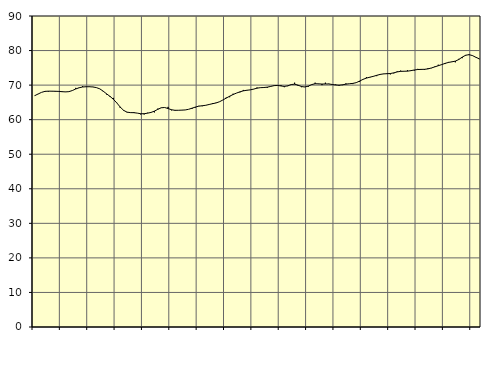
| Category | Piggar | Series 1 |
|---|---|---|
| nan | 67 | 66.94 |
| 87.0 | 67.4 | 67.44 |
| 87.0 | 67.9 | 67.9 |
| 87.0 | 68.3 | 68.19 |
| nan | 68.1 | 68.25 |
| 88.0 | 68.3 | 68.24 |
| 88.0 | 68.1 | 68.22 |
| 88.0 | 68.1 | 68.18 |
| nan | 68 | 68.1 |
| 89.0 | 68 | 68.04 |
| 89.0 | 68.1 | 68.11 |
| 89.0 | 68.4 | 68.43 |
| nan | 69.2 | 68.88 |
| 90.0 | 69.3 | 69.24 |
| 90.0 | 69.7 | 69.45 |
| 90.0 | 69.5 | 69.53 |
| nan | 69.6 | 69.53 |
| 91.0 | 69.5 | 69.46 |
| 91.0 | 69.3 | 69.29 |
| 91.0 | 68.9 | 68.93 |
| nan | 68.2 | 68.27 |
| 92.0 | 67.3 | 67.49 |
| 92.0 | 66.6 | 66.75 |
| 92.0 | 66.3 | 65.91 |
| nan | 64.9 | 64.85 |
| 93.0 | 63.4 | 63.65 |
| 93.0 | 62.8 | 62.69 |
| 93.0 | 62.1 | 62.17 |
| nan | 62.1 | 62.04 |
| 94.0 | 62.2 | 62.02 |
| 94.0 | 61.9 | 61.89 |
| 94.0 | 61.5 | 61.72 |
| nan | 61.5 | 61.72 |
| 95.0 | 62 | 61.88 |
| 95.0 | 62.1 | 62.09 |
| 95.0 | 62.1 | 62.47 |
| nan | 63.2 | 62.99 |
| 96.0 | 63.5 | 63.44 |
| 96.0 | 63.5 | 63.52 |
| 96.0 | 63.7 | 63.22 |
| nan | 62.7 | 62.87 |
| 97.0 | 62.8 | 62.71 |
| 97.0 | 62.7 | 62.72 |
| 97.0 | 62.8 | 62.76 |
| nan | 62.8 | 62.81 |
| 98.0 | 63 | 63 |
| 98.0 | 63.1 | 63.32 |
| 98.0 | 63.5 | 63.65 |
| nan | 64 | 63.91 |
| 99.0 | 63.9 | 64.03 |
| 99.0 | 64.2 | 64.16 |
| 99.0 | 64.4 | 64.39 |
| nan | 64.8 | 64.62 |
| 0.0 | 64.9 | 64.83 |
| 0.0 | 65.2 | 65.17 |
| 0.0 | 65.7 | 65.68 |
| nan | 66.4 | 66.24 |
| 1.0 | 66.5 | 66.79 |
| 1.0 | 67.5 | 67.27 |
| 1.0 | 67.7 | 67.69 |
| nan | 67.9 | 68.05 |
| 2.0 | 68.6 | 68.34 |
| 2.0 | 68.4 | 68.51 |
| 2.0 | 68.6 | 68.62 |
| nan | 68.8 | 68.84 |
| 3.0 | 69.3 | 69.11 |
| 3.0 | 69.3 | 69.26 |
| 3.0 | 69.2 | 69.3 |
| nan | 69.2 | 69.41 |
| 4.0 | 69.7 | 69.62 |
| 4.0 | 69.9 | 69.85 |
| 4.0 | 70 | 69.91 |
| nan | 70 | 69.76 |
| 5.0 | 69.4 | 69.62 |
| 5.0 | 69.7 | 69.79 |
| 5.0 | 70.2 | 70.16 |
| nan | 70.7 | 70.27 |
| 6.0 | 69.8 | 69.99 |
| 6.0 | 69.4 | 69.59 |
| 6.0 | 69.5 | 69.45 |
| nan | 69.5 | 69.71 |
| 7.0 | 70.2 | 70.15 |
| 7.0 | 70.7 | 70.4 |
| 7.0 | 70.3 | 70.37 |
| nan | 70 | 70.3 |
| 8.0 | 70.7 | 70.33 |
| 8.0 | 70.4 | 70.33 |
| 8.0 | 70.1 | 70.19 |
| nan | 70.2 | 70.04 |
| 9.0 | 69.8 | 69.98 |
| 9.0 | 70 | 70.09 |
| 9.0 | 70.5 | 70.27 |
| nan | 70.4 | 70.4 |
| 10.0 | 70.3 | 70.49 |
| 10.0 | 70.7 | 70.71 |
| 10.0 | 70.9 | 71.16 |
| nan | 71.7 | 71.66 |
| 11.0 | 72.3 | 72.03 |
| 11.0 | 72.2 | 72.29 |
| 11.0 | 72.6 | 72.53 |
| nan | 72.6 | 72.83 |
| 12.0 | 73 | 73.09 |
| 12.0 | 73.2 | 73.25 |
| 12.0 | 73.4 | 73.3 |
| nan | 73.1 | 73.36 |
| 13.0 | 73.4 | 73.55 |
| 13.0 | 74 | 73.82 |
| 13.0 | 74.2 | 73.98 |
| nan | 74 | 74.01 |
| 14.0 | 74.3 | 74.04 |
| 14.0 | 74.1 | 74.18 |
| 14.0 | 74.2 | 74.38 |
| nan | 74.7 | 74.51 |
| 15.0 | 74.4 | 74.55 |
| 15.0 | 74.4 | 74.57 |
| 15.0 | 74.9 | 74.7 |
| nan | 74.9 | 74.96 |
| 16.0 | 75.4 | 75.28 |
| 16.0 | 75.9 | 75.61 |
| 16.0 | 76 | 75.93 |
| nan | 76.1 | 76.29 |
| 17.0 | 76.7 | 76.57 |
| 17.0 | 76.8 | 76.74 |
| 17.0 | 76.6 | 76.94 |
| nan | 77.6 | 77.41 |
| 18.0 | 77.8 | 78.09 |
| 18.0 | 78.5 | 78.64 |
| 18.0 | 78.7 | 78.81 |
| nan | 78.5 | 78.55 |
| 19.0 | 78.1 | 78.05 |
| 19.0 | 77.5 | 77.61 |